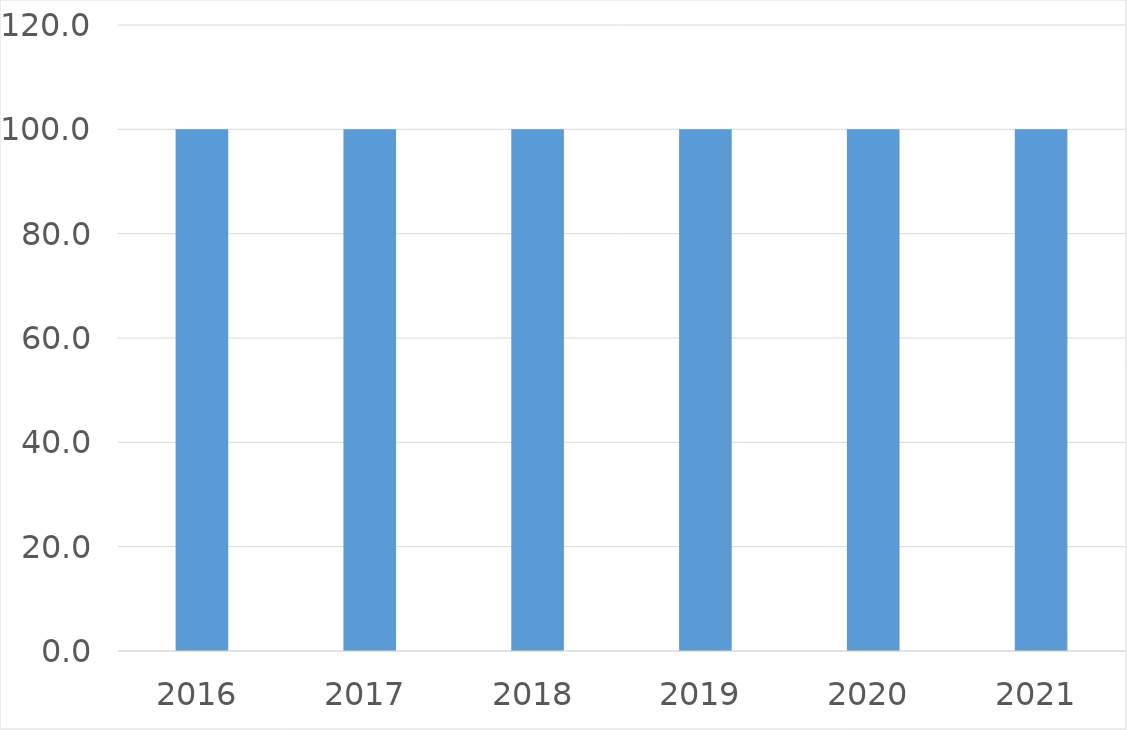
| Category | Series 0 |
|---|---|
| 2016 | 100 |
| 2017 | 100 |
| 2018 | 100 |
| 2019 | 100 |
| 2020 | 100 |
| 2021 | 100 |